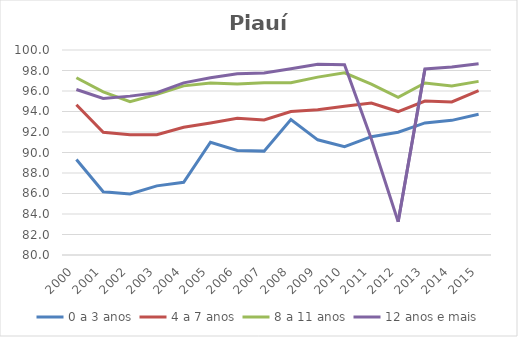
| Category | 0 a 3 anos | 4 a 7 anos | 8 a 11 anos | 12 anos e mais |
|---|---|---|---|---|
| 2000.0 | 89.32 | 94.665 | 97.291 | 96.151 |
| 2001.0 | 86.165 | 91.968 | 95.914 | 95.278 |
| 2002.0 | 85.954 | 91.723 | 94.961 | 95.5 |
| 2003.0 | 86.744 | 91.727 | 95.672 | 95.827 |
| 2004.0 | 87.099 | 92.455 | 96.499 | 96.797 |
| 2005.0 | 90.999 | 92.888 | 96.783 | 97.299 |
| 2006.0 | 90.198 | 93.346 | 96.687 | 97.672 |
| 2007.0 | 90.134 | 93.181 | 96.811 | 97.75 |
| 2008.0 | 93.221 | 94 | 96.806 | 98.176 |
| 2009.0 | 91.237 | 94.165 | 97.353 | 98.616 |
| 2010.0 | 90.576 | 94.503 | 97.775 | 98.562 |
| 2011.0 | 91.542 | 94.827 | 96.664 | 91.316 |
| 2012.0 | 91.976 | 93.996 | 95.381 | 83.238 |
| 2013.0 | 92.887 | 95.025 | 96.78 | 98.158 |
| 2014.0 | 93.137 | 94.936 | 96.488 | 98.343 |
| 2015.0 | 93.734 | 96.045 | 96.938 | 98.666 |